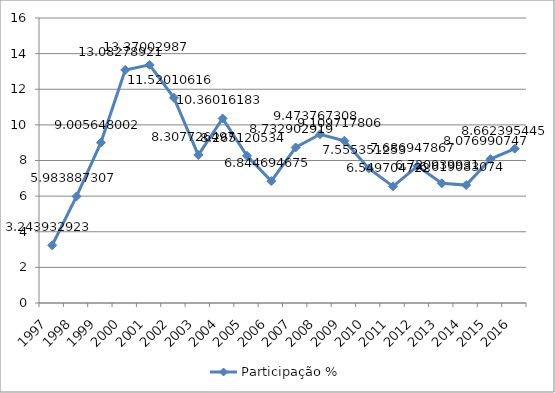
| Category | Participação % |
|---|---|
| 1997.0 | 3.244 |
| 1998.0 | 5.984 |
| 1999.0 | 9.006 |
| 2000.0 | 13.083 |
| 2001.0 | 13.37 |
| 2002.0 | 11.52 |
| 2003.0 | 8.308 |
| 2004.0 | 10.36 |
| 2005.0 | 8.265 |
| 2006.0 | 6.845 |
| 2007.0 | 8.733 |
| 2008.0 | 9.474 |
| 2009.0 | 9.11 |
| 2010.0 | 7.555 |
| 2011.0 | 6.55 |
| 2012.0 | 7.687 |
| 2013.0 | 6.721 |
| 2014.0 | 6.619 |
| 2015.0 | 8.077 |
| 2016.0 | 8.662 |